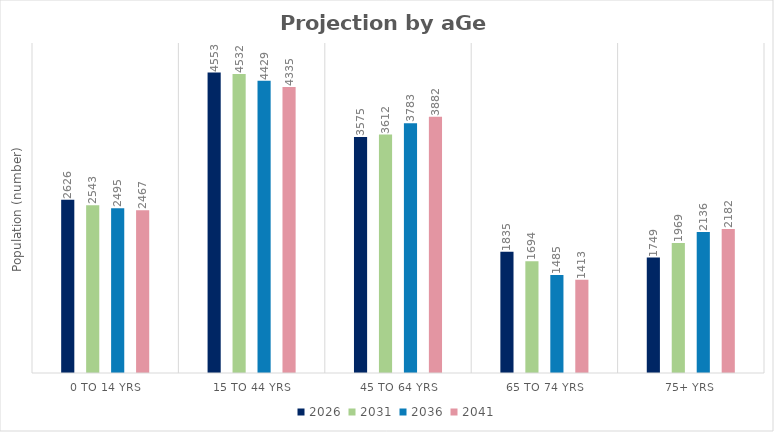
| Category | 2026 | 2031 | 2036 | 2041 |
|---|---|---|---|---|
| 0 to 14 yrs | 2626.373 | 2543.328 | 2494.766 | 2467.126 |
| 15 to 44 yrs | 4552.744 | 4531.63 | 4429.184 | 4335.149 |
| 45 to 64 yrs | 3574.602 | 3611.958 | 3782.567 | 3881.633 |
| 65 to 74 yrs | 1835.308 | 1693.51 | 1485.296 | 1413.005 |
| 75+ yrs | 1748.791 | 1969.299 | 2135.836 | 2181.611 |